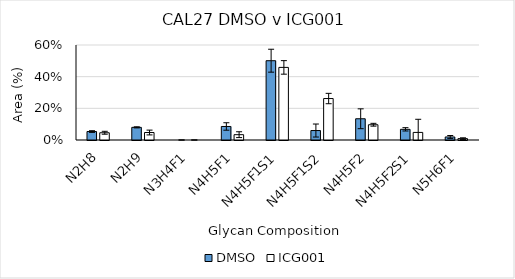
| Category | DMSO | ICG001 |
|---|---|---|
| N2H8 | 0.053 | 0.046 |
| N2H9 | 0.08 | 0.047 |
| N3H4F1 | 0 | 0 |
| N4H5F1 | 0.085 | 0.034 |
| N4H5F1S1 | 0.501 | 0.458 |
| N4H5F1S2 | 0.06 | 0.262 |
| N4H5F2 | 0.134 | 0.096 |
| N4H5F2S1 | 0.067 | 0.048 |
| N5H6F1 | 0.019 | 0.009 |